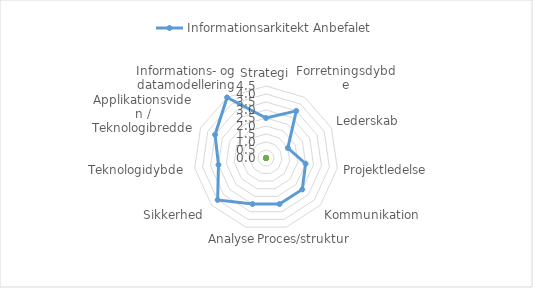
| Category | Informationsarkitekt |
|---|---|
| Strategi |  |
| Forretningsdybde |  |
| Lederskab |  |
| Projektledelse |  |
| Kommunikation |  |
| Proces/struktur |  |
| Analyse |  |
| Sikkerhed |  |
| Teknologidybde |  |
| Applikationsviden / Teknologibredde |  |
| Informations- og datamodellering |  |